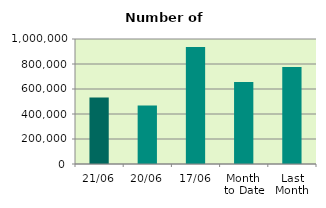
| Category | Series 0 |
|---|---|
| 21/06 | 532142 |
| 20/06 | 468306 |
| 17/06 | 936614 |
| Month 
to Date | 655984.933 |
| Last
Month | 776305.545 |